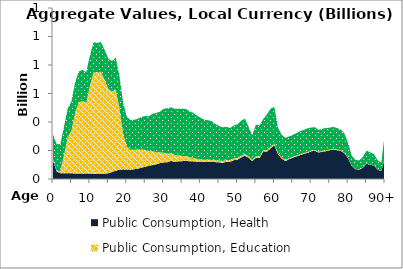
| Category | Public Consumption, Health | Public Consumption, Education | Public Consumption, Other than health and education |
|---|---|---|---|
| 0 | 130.981 | 6.51 | 175.674 |
|  | 53.508 | 6.794 | 183.344 |
| 2 | 41.211 | 14.417 | 190.032 |
| 3 | 40.144 | 129.911 | 199.991 |
| 4 | 41.16 | 254.944 | 199.684 |
| 5 | 39.999 | 297.284 | 207.523 |
| 6 | 38.602 | 427.215 | 213.734 |
| 7 | 38.254 | 499.754 | 215.697 |
| 8 | 39.086 | 508.579 | 218.313 |
| 9 | 38.153 | 497.325 | 213.268 |
| 10 | 38.919 | 615.231 | 211.704 |
| 11 | 36.204 | 712.485 | 211.161 |
| 12 | 36.309 | 710.539 | 207.975 |
| 13 | 35.83 | 716.297 | 208.926 |
| 14 | 37.222 | 659.125 | 209.534 |
| 15 | 40.388 | 591.399 | 213.707 |
| 16 | 48.726 | 563.949 | 214.843 |
| 17 | 58.212 | 570.997 | 223.765 |
| 18 | 65.417 | 434.864 | 224.584 |
| 19 | 67.668 | 251.008 | 219.315 |
| 20 | 66.362 | 161.807 | 209.619 |
| 21 | 65.464 | 140.686 | 208.059 |
| 22 | 68.559 | 137.117 | 209.898 |
| 23 | 73.103 | 133.688 | 215.86 |
| 24 | 78.736 | 128.831 | 228.517 |
| 25 | 86.855 | 117.356 | 238.374 |
| 26 | 91.952 | 104.515 | 243.349 |
| 27 | 97.616 | 97.49 | 263.028 |
| 28 | 102.963 | 85.626 | 275.193 |
| 29 | 111.537 | 75.174 | 285.947 |
| 30 | 116.329 | 68.41 | 307.978 |
| 31 | 117.486 | 60.53 | 318.671 |
| 32 | 126.734 | 54.638 | 320.521 |
| 33 | 120.948 | 48.79 | 323.516 |
| 34 | 124.007 | 42.952 | 326.697 |
| 35 | 124.859 | 37.181 | 331.644 |
| 36 | 128.653 | 33.03 | 329.709 |
| 37 | 123.916 | 28.72 | 323.188 |
| 38 | 123.787 | 24.39 | 316.077 |
| 39 | 121.397 | 19.872 | 303.696 |
| 40 | 120.13 | 16.102 | 294.073 |
| 41 | 119.266 | 15.471 | 281.344 |
| 42 | 121.135 | 15.125 | 276.612 |
| 43 | 118.81 | 14.797 | 272.42 |
| 44 | 118.559 | 13.957 | 254.037 |
| 45 | 117.054 | 13.355 | 242.365 |
| 46 | 113.443 | 12.931 | 235.726 |
| 47 | 120.452 | 12.679 | 233.922 |
| 48 | 120.264 | 12.16 | 224.816 |
| 49 | 131.926 | 12.226 | 232.093 |
| 50 | 135.414 | 12.163 | 235.856 |
| 51 | 151.574 | 12.286 | 244.847 |
| 52 | 162.603 | 12.239 | 249.01 |
| 53 | 150.226 | 10.597 | 208.414 |
| 54 | 125.102 | 9.103 | 171.785 |
| 55 | 149.832 | 10.702 | 221.558 |
| 56 | 146.87 | 10.456 | 219.603 |
| 57 | 194.195 | 10.19 | 217.037 |
| 58 | 191.959 | 11.199 | 250.011 |
| 59 | 215.428 | 11.652 | 267.41 |
| 60 | 237.707 | 11.098 | 256.768 |
| 61 | 174.225 | 8.046 | 177.034 |
| 62 | 143.191 | 7.227 | 159.487 |
| 63 | 125.713 | 6.929 | 156.461 |
| 64 | 139.385 | 6.615 | 153.133 |
| 65 | 150.259 | 6.44 | 153.796 |
| 66 | 157.943 | 6.357 | 157.101 |
| 67 | 167.89 | 6.322 | 161.867 |
| 68 | 176.593 | 6.116 | 161.92 |
| 69 | 183.009 | 6.067 | 166.518 |
| 70 | 194.862 | 5.67 | 161.313 |
| 71 | 197.522 | 5.582 | 159.773 |
| 72 | 185.682 | 5.349 | 154.247 |
| 73 | 192.246 | 5.33 | 155.13 |
| 74 | 195.351 | 5.34 | 157.126 |
| 75 | 202.051 | 5.136 | 153.174 |
| 76 | 207.178 | 5.062 | 153.385 |
| 77 | 201.943 | 4.885 | 150.866 |
| 78 | 196.817 | 4.613 | 145.867 |
| 79 | 181.084 | 4.14 | 134.379 |
| 80 | 145.424 | 3.084 | 103.346 |
| 81 | 92.191 | 1.975 | 68.531 |
| 82 | 69.399 | 1.748 | 62.955 |
| 83 | 64.84 | 1.708 | 63.793 |
| 84 | 78.51 | 1.905 | 73.837 |
| 85 | 106.726 | 2.245 | 90.283 |
| 86 | 99.098 | 2.036 | 85.467 |
| 87 | 95.148 | 1.788 | 78.681 |
| 88 | 65.368 | 1.415 | 65.634 |
| 89 | 55.534 | 1.203 | 58.915 |
| 90+ | 149.939 | 3.429 | 176.753 |